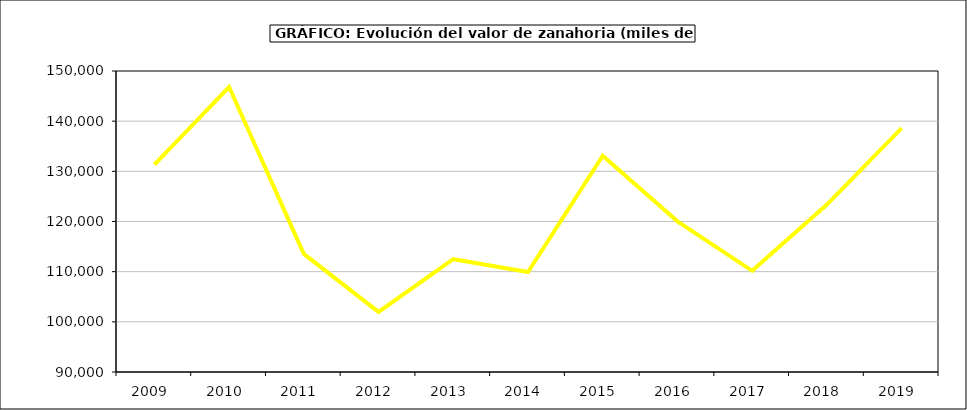
| Category | Valor |
|---|---|
| 2009.0 | 131354.206 |
| 2010.0 | 146811.606 |
| 2011.0 | 113537.975 |
| 2012.0 | 101980.864 |
| 2013.0 | 112485.085 |
| 2014.0 | 109919.203 |
| 2015.0 | 133120 |
| 2016.0 | 120031 |
| 2017.0 | 110169.914 |
| 2018.0 | 123370.95 |
| 2019.0 | 138615.206 |